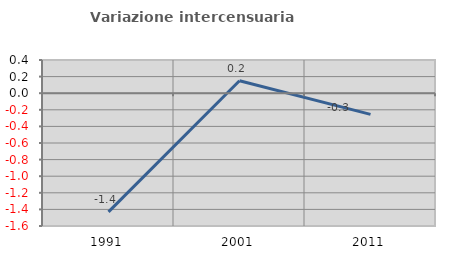
| Category | Variazione intercensuaria annua |
|---|---|
| 1991.0 | -1.43 |
| 2001.0 | 0.151 |
| 2011.0 | -0.255 |